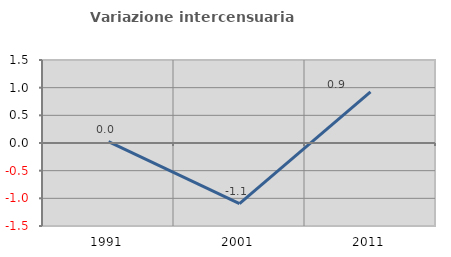
| Category | Variazione intercensuaria annua |
|---|---|
| 1991.0 | 0.024 |
| 2001.0 | -1.097 |
| 2011.0 | 0.925 |